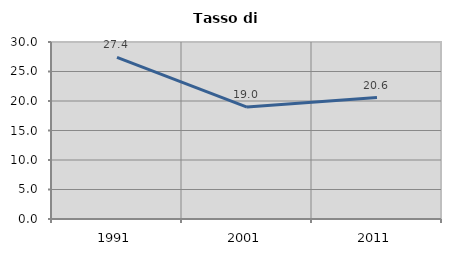
| Category | Tasso di disoccupazione   |
|---|---|
| 1991.0 | 27.392 |
| 2001.0 | 18.979 |
| 2011.0 | 20.578 |